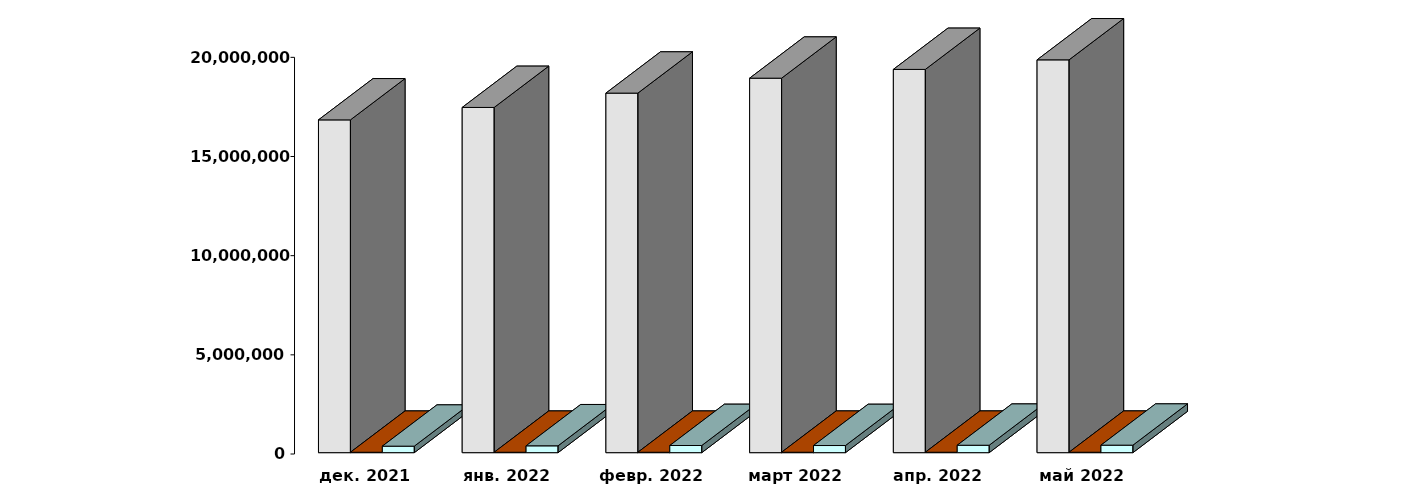
| Category | Физические лица | Юридические лица | Клиенты, передавшие свои средства в ДУ |
|---|---|---|---|
| 2021-12-28 | 16779069 | 20446 | 327432 |
| 2022-01-28 | 17405817 | 20536 | 345411 |
| 2022-02-28 | 18128529 | 20698 | 361205 |
| 2022-03-30 | 18881687 | 21131 | 360205 |
| 2022-04-30 | 19323213 | 21524 | 374023 |
| 2022-05-31 | 19805248 | 21686 | 377979 |